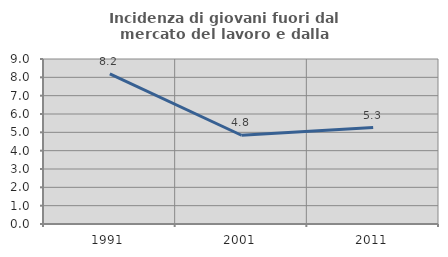
| Category | Incidenza di giovani fuori dal mercato del lavoro e dalla formazione  |
|---|---|
| 1991.0 | 8.192 |
| 2001.0 | 4.842 |
| 2011.0 | 5.263 |